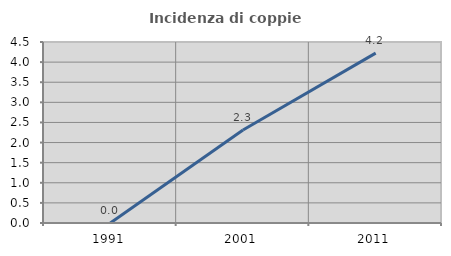
| Category | Incidenza di coppie miste |
|---|---|
| 1991.0 | 0 |
| 2001.0 | 2.312 |
| 2011.0 | 4.223 |